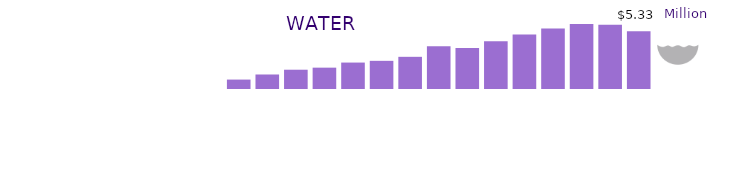
| Category | Water |
|---|---|
| 1996 | 0 |
| 1997 | 0 |
| 1998 | 0 |
| 1999 | 0 |
| 2000 | 0 |
| 2001 | 0 |
| 2002 | 0.87 |
| 2003 | 1.34 |
| 2004 | 1.78 |
| 2005 | 1.97 |
| 2006 | 2.44 |
| 2007 | 2.6 |
| 2008 | 2.97 |
| 2009 | 3.94 |
| 2010 | 3.79 |
| 2011 | 4.4 |
| 2012 | 5.02 |
| 2013 | 5.58 |
| 2014 | 6.49 |
| 2015 | 5.92 |
| 2016 | 5.33 |